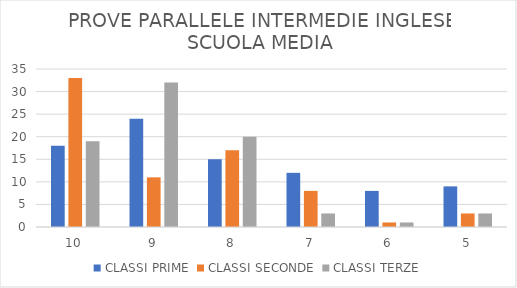
| Category | CLASSI PRIME | CLASSI SECONDE | CLASSI TERZE |
|---|---|---|---|
| 10.0 | 18 | 33 | 19 |
| 9.0 | 24 | 11 | 32 |
| 8.0 | 15 | 17 | 20 |
| 7.0 | 12 | 8 | 3 |
| 6.0 | 8 | 1 | 1 |
| 5.0 | 9 | 3 | 3 |